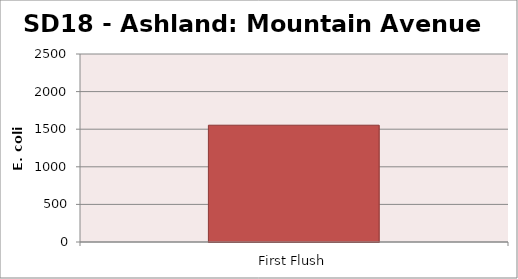
| Category | E. coli MPN |
|---|---|
| First Flush | 1553.1 |